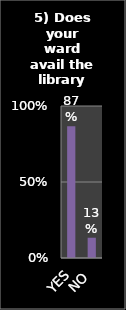
| Category | Series 0 |
|---|---|
| YES | 0.867 |
| NO | 0.133 |